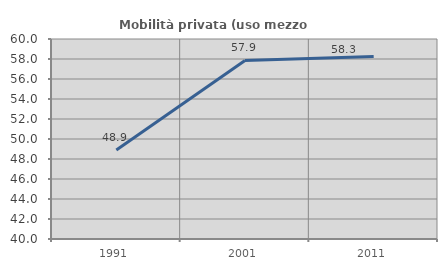
| Category | Mobilità privata (uso mezzo privato) |
|---|---|
| 1991.0 | 48.905 |
| 2001.0 | 57.857 |
| 2011.0 | 58.255 |